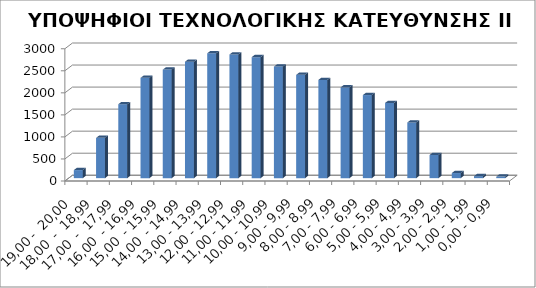
| Category | ΥΠΟΨΗΦΙΟΙ |
|---|---|
| 19,00 -  20,00 | 183 |
| 18,00  -  18,99 | 914 |
| 17,00  -  17,99 | 1677 |
| 16,00  - 16,99 | 2275 |
| 15,00  - 15,99 | 2462 |
| 14,00  - 14,99 | 2642 |
| 13,00 - 13,99 | 2833 |
| 12,00 - 12,99 | 2805 |
| 11,00 - 11,99 | 2745 |
| 10,00 - 10,99 | 2530 |
| 9,00 - 9,99 | 2344 |
| 8,00 - 8,99 | 2228 |
| 7,00 - 7,99 | 2059 |
| 6,00 - 6,99 | 1885 |
| 5,00 - 5,99 | 1706 |
| 4,00 - 4,99 | 1263 |
| 3,00 - 3,99 | 525 |
| 2,00 - 2,99 | 116 |
| 1,00 - 1,99 | 45 |
| 0,00 - 0,99 | 35 |